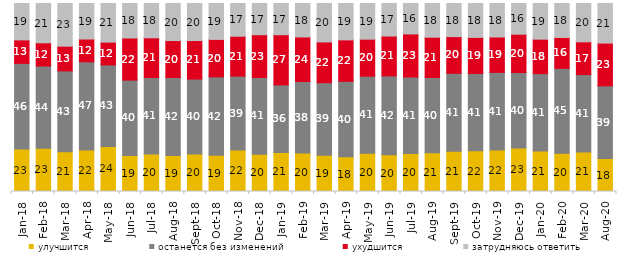
| Category | улучшится | останется без изменений | ухудшится | затрудняюсь ответить |
|---|---|---|---|---|
| 2018-01-01 | 22.55 | 45.6 | 12.5 | 19.35 |
| 2018-02-01 | 23 | 43.75 | 12.35 | 20.9 |
| 2018-03-01 | 21.15 | 43 | 13.15 | 22.7 |
| 2018-04-01 | 22.05 | 46.95 | 12.1 | 18.9 |
| 2018-05-01 | 23.95 | 43.35 | 12.15 | 20.55 |
| 2018-06-01 | 19.15 | 40.1 | 22.4 | 18.35 |
| 2018-07-01 | 19.95 | 40.7 | 21.1 | 18.25 |
| 2018-08-01 | 19.15 | 41.5 | 19.65 | 19.7 |
| 2018-09-01 | 19.95 | 39.85 | 20.5 | 19.7 |
| 2018-10-01 | 19.3 | 41.7 | 19.9 | 19.1 |
| 2018-11-01 | 22.056 | 39.321 | 21.208 | 17.415 |
| 2018-12-01 | 19.8 | 40.85 | 22.75 | 16.6 |
| 2019-01-01 | 20.75 | 35.95 | 26.7 | 16.6 |
| 2019-02-01 | 20.45 | 38.05 | 23.7 | 17.8 |
| 2019-03-01 | 19.344 | 38.538 | 21.681 | 20.438 |
| 2019-04-01 | 18.465 | 40.149 | 22.03 | 19.356 |
| 2019-05-01 | 20.406 | 40.911 | 19.713 | 18.97 |
| 2019-06-01 | 19.601 | 41.895 | 21.197 | 17.307 |
| 2019-07-01 | 20.149 | 40.743 | 22.921 | 16.188 |
| 2019-08-01 | 20.579 | 40.06 | 21.429 | 17.932 |
| 2019-09-01 | 21.386 | 41.485 | 19.505 | 17.624 |
| 2019-10-01 | 21.683 | 41.089 | 19.208 | 18.02 |
| 2019-11-01 | 22.03 | 41.337 | 18.812 | 17.822 |
| 2019-12-01 | 23.168 | 40.099 | 20.396 | 16.337 |
| 2020-01-01 | 21.485 | 41.188 | 18.366 | 18.96 |
| 2020-02-01 | 20.297 | 45.198 | 16.436 | 18.069 |
| 2020-03-01 | 21.071 | 41.101 | 17.452 | 20.377 |
| 2020-08-01 | 17.527 | 38.679 | 22.741 | 21.053 |